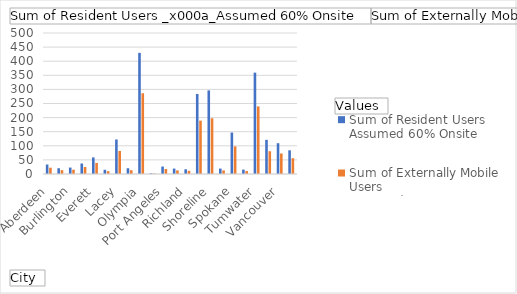
| Category | Sum of Resident Users 
Assumed 60% Onsite | Sum of Externally Mobile Users 
Assumed 40% Teleworking |
|---|---|---|
| Aberdeen | 33.6 | 22.4 |
| Bellingham | 20.4 | 13.6 |
| Burlington | 22.8 | 15.2 |
| Chehalis | 37.2 | 24.8 |
| Everett | 58.8 | 39.2 |
| Kelso | 15 | 10 |
| Lacey | 122.4 | 81.6 |
| Mount Vernon | 20.4 | 13.6 |
| Olympia | 429.6 | 286.4 |
| Pasco | 2.4 | 1.6 |
| Port Angeles | 26.4 | 17.6 |
| Port Orchard | 19.2 | 12.8 |
| Richland | 16.8 | 11.2 |
| Seattle | 283.8 | 189.2 |
| Shoreline | 296.4 | 197.6 |
| Snoqualmie Pass | 19.2 | 12.8 |
| Spokane | 147 | 98 |
| Tacoma | 15.6 | 10.4 |
| Tumwater | 359.4 | 239.6 |
| Union Gap | 121.2 | 80.8 |
| Vancouver | 109.2 | 72.8 |
| Wenatchee | 84 | 56 |